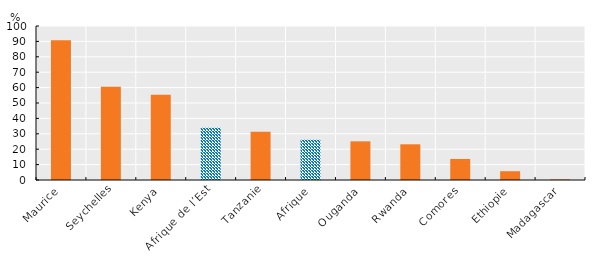
| Category | % de la population pouvant acheter 1 GB de données |
|---|---|
| Maurice | 90.747 |
| Seychelles | 60.592 |
| Kenya | 55.299 |
| Afrique de l’Est | 34.002 |
| Tanzanie | 31.409 |
| Afrique | 26.155 |
| Ouganda | 25.1 |
| Rwanda | 23.181 |
| Comores | 13.619 |
| Ethiopie | 5.713 |
| Madagascar | 0.359 |